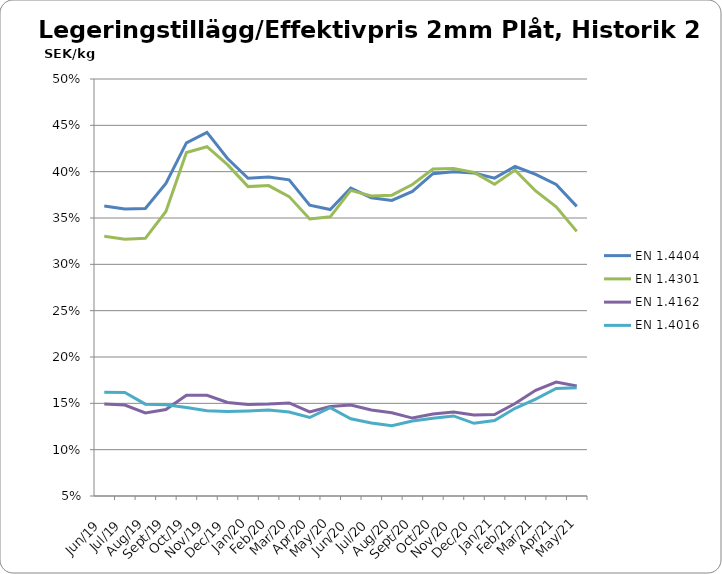
| Category | EN 1.4404 | EN 1.4301 | EN 1.4162  | EN 1.4016 |
|---|---|---|---|---|
| 2019-06-01 | 0.363 | 0.33 | 0.149 | 0.162 |
| 2019-07-01 | 0.36 | 0.327 | 0.148 | 0.162 |
| 2019-08-01 | 0.36 | 0.328 | 0.14 | 0.149 |
| 2019-09-01 | 0.387 | 0.357 | 0.143 | 0.149 |
| 2019-10-01 | 0.431 | 0.421 | 0.159 | 0.145 |
| 2019-11-01 | 0.442 | 0.427 | 0.159 | 0.142 |
| 2019-12-01 | 0.414 | 0.408 | 0.151 | 0.141 |
| 2020-01-01 | 0.393 | 0.384 | 0.149 | 0.142 |
| 2020-02-01 | 0.394 | 0.385 | 0.149 | 0.143 |
| 2020-03-01 | 0.391 | 0.373 | 0.15 | 0.141 |
| 2020-04-01 | 0.364 | 0.349 | 0.141 | 0.135 |
| 2020-05-01 | 0.359 | 0.351 | 0.146 | 0.145 |
| 2020-06-01 | 0.382 | 0.38 | 0.148 | 0.133 |
| 2020-07-01 | 0.372 | 0.374 | 0.143 | 0.129 |
| 2020-08-01 | 0.369 | 0.375 | 0.14 | 0.126 |
| 2020-09-01 | 0.379 | 0.386 | 0.134 | 0.131 |
| 2020-10-01 | 0.398 | 0.403 | 0.138 | 0.134 |
| 2020-11-01 | 0.4 | 0.403 | 0.141 | 0.136 |
| 2020-12-01 | 0.399 | 0.399 | 0.137 | 0.128 |
| 2021-01-01 | 0.393 | 0.386 | 0.138 | 0.131 |
| 2021-02-01 | 0.406 | 0.402 | 0.15 | 0.145 |
| 2021-03-01 | 0.397 | 0.379 | 0.164 | 0.155 |
| 2021-04-01 | 0.386 | 0.362 | 0.173 | 0.166 |
| 2021-05-01 | 0.363 | 0.336 | 0.169 | 0.167 |